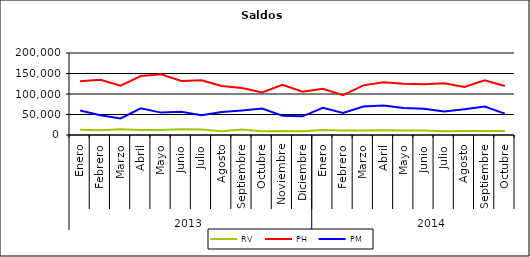
| Category | RV | PH | PM |
|---|---|---|---|
| 0 | 12966.437 | 131380.856 | 59975.653 |
| 1 | 11432.271 | 134655.891 | 48046.612 |
| 2 | 14149.543 | 120343.782 | 40297.909 |
| 3 | 12403.249 | 143830.507 | 64946.114 |
| 4 | 12323.134 | 148139.781 | 54592.514 |
| 5 | 13759.976 | 131634.752 | 56652.701 |
| 6 | 13256.014 | 133515.147 | 47907.561 |
| 7 | 9335.8 | 119600.732 | 55860.576 |
| 8 | 13362.811 | 114843.232 | 59771.51 |
| 9 | 9080.978 | 103607.627 | 64696.186 |
| 10 | 9993.913 | 122533.872 | 46801.148 |
| 11 | 9303.464 | 105747.395 | 45455.331 |
| 12 | 12145.055 | 112918.262 | 66200.17 |
| 13 | 10742.048 | 97242.789 | 53817.215 |
| 14 | 10795.854 | 121097.504 | 69409.543 |
| 15 | 11604.091 | 128798.176 | 72161.549 |
| 16 | 11264.83 | 125268.689 | 65570.493 |
| 17 | 10724.052 | 123922.82 | 64054.99 |
| 18 | 9051.652 | 126086.706 | 57402.892 |
| 19 | 9700.076 | 117038.593 | 63086.988 |
| 20 | 9709.733 | 133155.935 | 69429.611 |
| 21 | 10060.869 | 119576.756 | 52179.353 |